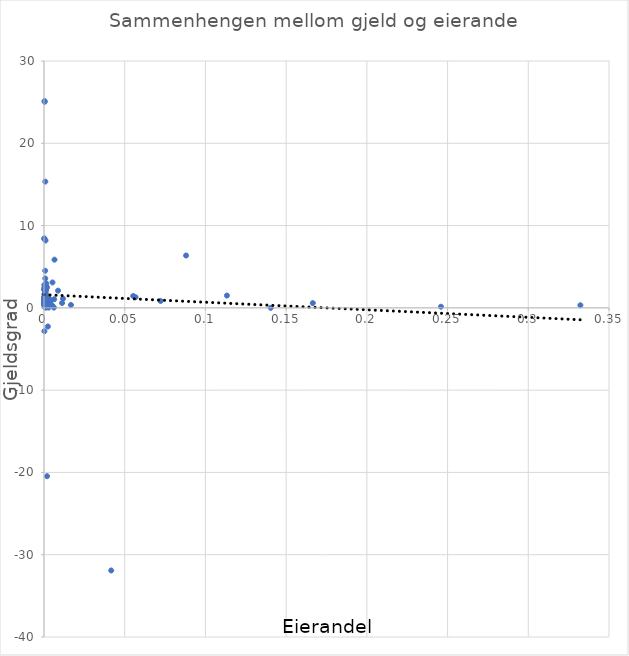
| Category | gjennomsnitt |
|---|---|
| 0.00023115298681709233 | 2.434 |
| 0.0012 | 0.025 |
| 0.0008 | 0.815 |
| 0.00021945210655072655 | 2.208 |
| 0.0015813784762450012 | 0.615 |
| 0.0 | 0.45 |
| 0.005172048625014135 | 0.27 |
| 0.0008861980235444139 | 1.765 |
| 0.1665303857666496 | 0.579 |
| 0.0004 | 1.363 |
| 0.0013 | 0.45 |
| 0.0010223319461726752 | 2.635 |
| 0.0008191903449479407 | 15.343 |
| 0.00013728016980114066 | 0.996 |
| 0.0112 | 0.589 |
| 0.00020851698518656965 | 0.468 |
| 0.0018278201209073978 | 0.727 |
| 0.0006695918020169416 | 0.631 |
| 0.33227900073781924 | 0.316 |
| 0.0001265607998158437 | 1.222 |
| 0.0005 | 0.775 |
| 0.0006018495806229883 | 2.466 |
| 0.0018794269012865049 | -20.458 |
| 0.011774773002243258 | 1.118 |
| 0.00628696670859278 | 1.043 |
| 0.0001980452650267387 | 0.592 |
| 0.0007799970978285392 | 3.578 |
| 0.00016414944962567013 | 0.529 |
| 0.0021391691434422756 | 0.969 |
| 0.0011680213442347104 | 0.252 |
| 0.0004842428578682265 | 1.3 |
| 0.0011154443757192289 | 0.491 |
| 0.002806774055238904 | 0.03 |
| 0.0031 | 1.16 |
| 0.0016 | 1.314 |
| 0.0007 | 0.527 |
| 0.0037123537913334543 | 0.725 |
| 0.0006672693960784447 | 1.219 |
| 0.0007149598565675485 | 4.51 |
| 0.14047338571960066 | 0.001 |
| 0.0087 | 2.091 |
| 0.07220604932238771 | 0.835 |
| 0.24588935695115402 | 0.139 |
| 0.003467043595915613 | 0.598 |
| 0.0018903057531208395 | 2.495 |
| 0.0035785120476896914 | 0.842 |
| 0.000699357659883844 | 2.139 |
| 0.0061503534018977875 | 0.03 |
| 0.005258083669203507 | 3.088 |
| 0.0014317608837763843 | 1.093 |
| 0.0006774924185142361 | 1.843 |
| 0.00410818701756315 | 0.826 |
| 0.0024 | -2.269 |
| 0.0002595313500263658 | 2.814 |
| 0.0002150097562035386 | 0.384 |
| 0.00012615069855855925 | 0.425 |
| 0.0018477978961699518 | 1.337 |
| 0.0013458433491862706 | 2.148 |
| 0.00046785156207055235 | 1.737 |
| 0.0005476785940811693 | 2.457 |
| 0.0013356570894122175 | 2.982 |
| 0.00042150122363745525 | 0.893 |
| 0.00025064852215895194 | -2.837 |
| 0.0022303495682828777 | 0.696 |
| 0.0009988300305536235 | 0.634 |
| 0.00165893698442908 | 0.296 |
| 0.0005247466455924037 | 1.208 |
| 0.00040691446519699115 | 2.698 |
| 0.0003990322715591934 | 0.723 |
| 0.0004880685234893642 | 2.434 |
| 0.00015238989812994718 | 0.807 |
| 0.00041008365977458837 | 0.283 |
| 0.0027 | 0.753 |
| 0.055245692699294024 | 1.44 |
| 0.0011458478338760992 | 0.492 |
| 0.0010843163189620288 | 2.845 |
| 0.0001523884416425563 | 0.672 |
| 0.0002259066787112356 | 0.577 |
| 0.0004942704226655578 | 2.306 |
| 0.0006428551134384107 | 2.306 |
| 0.0009999908251586977 | 0.925 |
| 0.016696945936160466 | 0.352 |
| 0.0005084635570901136 | 0.484 |
| 0.00072015186675707 | 1.725 |
| 0.08801167522340708 | 6.361 |
| 0.00027844682435660583 | 1.053 |
| 0.00025298676391990115 | 1.039 |
| 0.000840726804417122 | 0.459 |
| 0.0011553190869533444 | 0.459 |
| 0.0022431693858321992 | 0.771 |
| 0.0008390870070072087 | 1.86 |
| 0.0004443807727332833 | 25.045 |
| 0.0009427044041259418 | 8.189 |
| 0.0010006183918867902 | 0.983 |
| 0.0003374569664220461 | 0.917 |
| 0.00016642098091662047 | 8.406 |
| 0.11331668565997388 | 1.496 |
| 0.00020837098023288898 | 8.438 |
| 0.00034641073943863295 | 1.64 |
| 0.00011097748891312593 | 0.857 |
| 0.0002243079874956221 | 1.359 |
| 0.006512622934518222 | 5.856 |
| 0.0005152007740349949 | 0.823 |
| 0.00016696260084055116 | 2.216 |
| 3.027877476889338e-05 | 1.136 |
| 0.05675197311235473 | 1.292 |
| 0.00041008365977458837 | 2.222 |
| 0.001434 | 1.546 |
| 0.0003609831443199048 | 0.097 |
| 0.0003489786288085406 | 25.123 |
| 0.041641115984213266 | -31.916 |
| 0.0008499078682596311 | 1.3 |